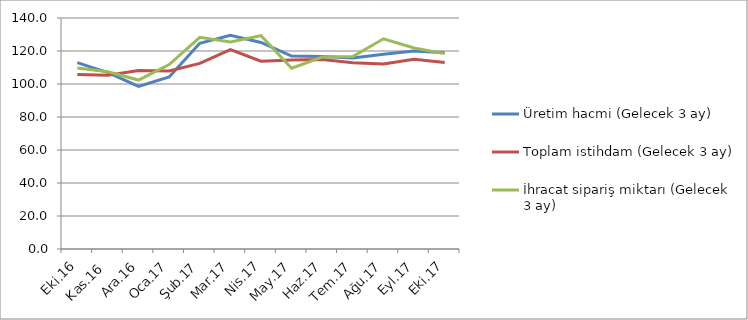
| Category | Üretim hacmi (Gelecek 3 ay) | Toplam istihdam (Gelecek 3 ay) | İhracat sipariş miktarı (Gelecek 3 ay) |
|---|---|---|---|
| Eki.16 | 113 | 105.8 | 109.7 |
| Kas.16 | 106.9 | 105.3 | 107.4 |
| Ara.16 | 98.6 | 108.2 | 102.4 |
| Oca.17 | 104.3 | 107.9 | 111.8 |
| Şub.17 | 124.7 | 112.5 | 128.3 |
| Mar.17 | 129.5 | 120.9 | 125.4 |
| Nis.17 | 125.2 | 113.8 | 129.3 |
| May.17 | 116.9 | 114.5 | 109.6 |
| Haz.17 | 116.6 | 114.9 | 116.3 |
| Tem.17 | 115.8 | 112.9 | 116.7 |
| Ağu.17 | 118 | 112.1 | 127.4 |
| Eyl.17 | 120 | 115 | 121.8 |
| Eki.17 | 119 | 113.1 | 118.4 |